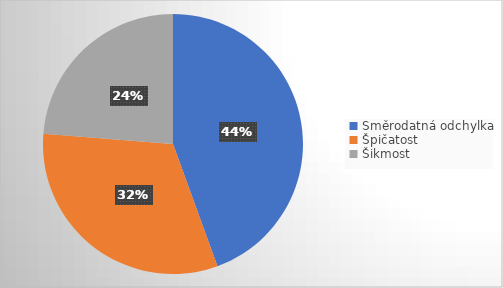
| Category | Series 0 |
|---|---|
| Směrodatná odchylka | 88 |
| Špičatost | 63 |
| Šikmost | 47 |